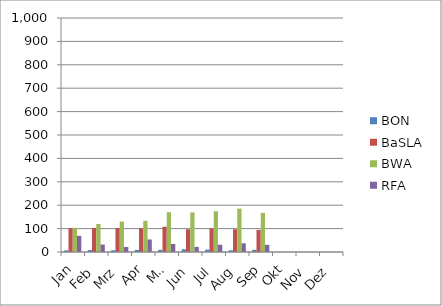
| Category | BON | BaSLA | BWA | RFA |
|---|---|---|---|---|
| Jan | 7.091 | 102.227 | 103.364 | 69.091 |
| Feb | 8.3 | 102.7 | 119.8 | 31.9 |
| Mrz | 7.55 | 102.65 | 130 | 21.65 |
| Apr | 8.857 | 101.952 | 133.286 | 53.429 |
| Mai | 9.2 | 108.05 | 170.25 | 34.6 |
| Jun | 11.45 | 97.25 | 169.25 | 22 |
| Jul | 10.174 | 101.043 | 174.217 | 31 |
| Aug | 7.238 | 97.19 | 185.476 | 37.429 |
| Sep | 9.476 | 94.333 | 167.143 | 30.571 |
| Okt | 0 | 0 | 0 | 0 |
| Nov | 0 | 0 | 0 | 0 |
| Dez | 0 | 0 | 0 | 0 |